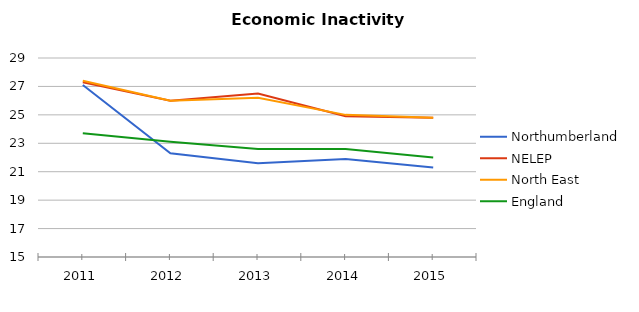
| Category | Northumberland | NELEP | North East | England |
|---|---|---|---|---|
| 2011.0 | 27.1 | 27.3 | 27.4 | 23.7 |
| 2012.0 | 22.3 | 26 | 26 | 23.1 |
| 2013.0 | 21.6 | 26.5 | 26.2 | 22.6 |
| 2014.0 | 21.9 | 24.9 | 25 | 22.6 |
| 2015.0 | 21.3 | 24.8 | 24.8 | 22 |